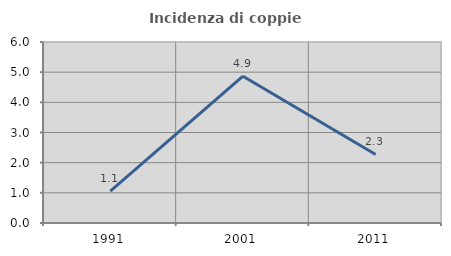
| Category | Incidenza di coppie miste |
|---|---|
| 1991.0 | 1.058 |
| 2001.0 | 4.867 |
| 2011.0 | 2.273 |